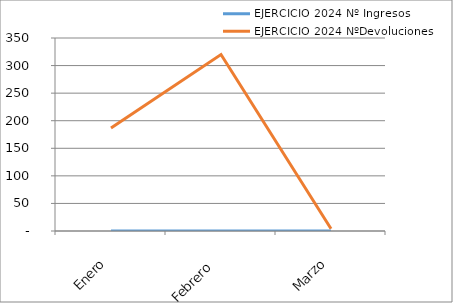
| Category | EJERCICIO 2024 |
|---|---|
| Enero | 187 |
| Febrero  | 320 |
| Marzo | 4 |